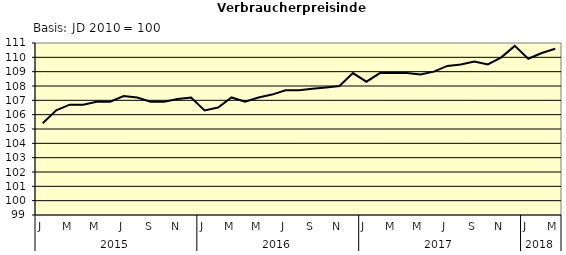
| Category | Series 0 |
|---|---|
| 0 | 105.4 |
| 1 | 106.3 |
| 2 | 106.7 |
| 3 | 106.7 |
| 4 | 106.9 |
| 5 | 106.9 |
| 6 | 107.3 |
| 7 | 107.2 |
| 8 | 106.9 |
| 9 | 106.9 |
| 10 | 107.1 |
| 11 | 107.2 |
| 12 | 106.3 |
| 13 | 106.5 |
| 14 | 107.2 |
| 15 | 106.9 |
| 16 | 107.2 |
| 17 | 107.4 |
| 18 | 107.7 |
| 19 | 107.7 |
| 20 | 107.8 |
| 21 | 107.9 |
| 22 | 108 |
| 23 | 108.9 |
| 24 | 108.3 |
| 25 | 108.9 |
| 26 | 108.9 |
| 27 | 108.9 |
| 28 | 108.8 |
| 29 | 109 |
| 30 | 109.4 |
| 31 | 109.5 |
| 32 | 109.7 |
| 33 | 109.5 |
| 34 | 110 |
| 35 | 110.8 |
| 36 | 109.9 |
| 37 | 110.3 |
| 38 | 110.6 |